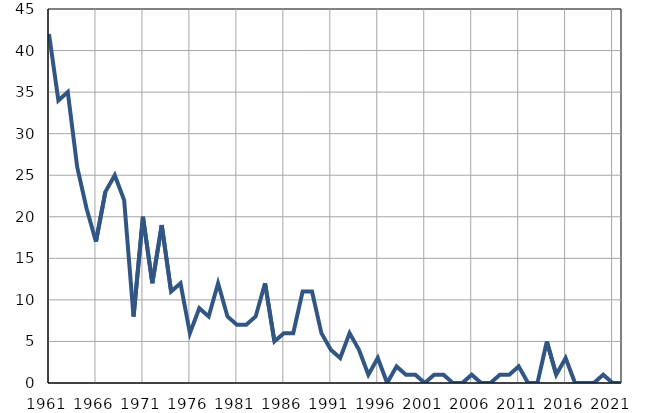
| Category | Умрла 
одојчад |
|---|---|
| 1961.0 | 42 |
| 1962.0 | 34 |
| 1963.0 | 35 |
| 1964.0 | 26 |
| 1965.0 | 21 |
| 1966.0 | 17 |
| 1967.0 | 23 |
| 1968.0 | 25 |
| 1969.0 | 22 |
| 1970.0 | 8 |
| 1971.0 | 20 |
| 1972.0 | 12 |
| 1973.0 | 19 |
| 1974.0 | 11 |
| 1975.0 | 12 |
| 1976.0 | 6 |
| 1977.0 | 9 |
| 1978.0 | 8 |
| 1979.0 | 12 |
| 1980.0 | 8 |
| 1981.0 | 7 |
| 1982.0 | 7 |
| 1983.0 | 8 |
| 1984.0 | 12 |
| 1985.0 | 5 |
| 1986.0 | 6 |
| 1987.0 | 6 |
| 1988.0 | 11 |
| 1989.0 | 11 |
| 1990.0 | 6 |
| 1991.0 | 4 |
| 1992.0 | 3 |
| 1993.0 | 6 |
| 1994.0 | 4 |
| 1995.0 | 1 |
| 1996.0 | 3 |
| 1997.0 | 0 |
| 1998.0 | 2 |
| 1999.0 | 1 |
| 2000.0 | 1 |
| 2001.0 | 0 |
| 2002.0 | 1 |
| 2003.0 | 1 |
| 2004.0 | 0 |
| 2005.0 | 0 |
| 2006.0 | 1 |
| 2007.0 | 0 |
| 2008.0 | 0 |
| 2009.0 | 1 |
| 2010.0 | 1 |
| 2011.0 | 2 |
| 2012.0 | 0 |
| 2013.0 | 0 |
| 2014.0 | 5 |
| 2015.0 | 1 |
| 2016.0 | 3 |
| 2017.0 | 0 |
| 2018.0 | 0 |
| 2019.0 | 0 |
| 2020.0 | 1 |
| 2021.0 | 0 |
| 2022.0 | 0 |